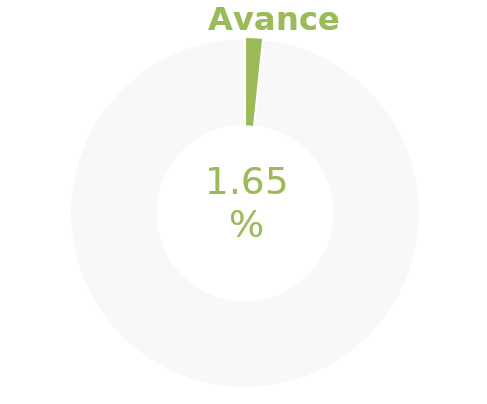
| Category | Series 0 |
|---|---|
| Acumulado 1 Trimestre | 0.016 |
| Año | -0.984 |